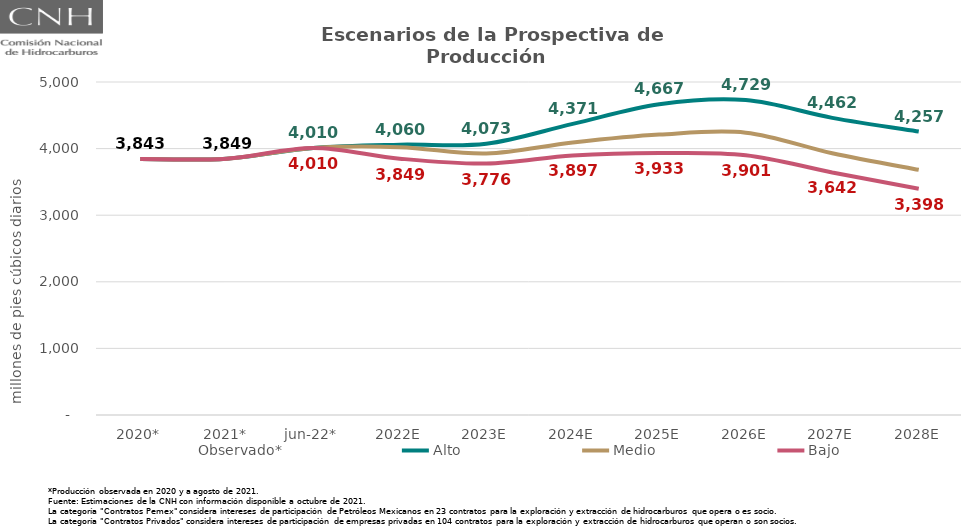
| Category | Observado* | Alto | Medio | Bajo |
|---|---|---|---|---|
| 2020* | 3843.295 | 3843.295 | 3843.295 | 3843.295 |
| 2021* | 3849.2 | 3849.2 | 3849.2 | 3849.2 |
| jun-22* | 4009.858 | 4009.858 | 4009.858 | 4009.858 |
| 2022E | 4021.769 | 4059.517 | 4021.769 | 3848.935 |
| 2023E | 3925.953 | 4072.67 | 3925.953 | 3775.744 |
| 2024E | 4091.168 | 4371.261 | 4091.168 | 3896.974 |
| 2025E | 4210.236 | 4666.682 | 4210.236 | 3933.194 |
| 2026E | 4239.197 | 4728.504 | 4239.197 | 3900.728 |
| 2027E | 3931.086 | 4461.611 | 3931.086 | 3642.284 |
| 2028E | 3681.179 | 4256.501 | 3681.179 | 3398.065 |